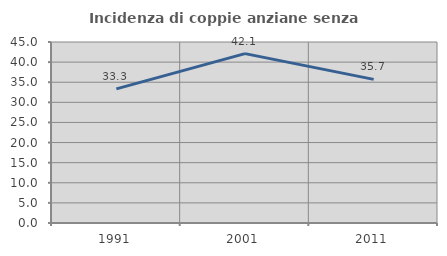
| Category | Incidenza di coppie anziane senza figli  |
|---|---|
| 1991.0 | 33.333 |
| 2001.0 | 42.105 |
| 2011.0 | 35.714 |